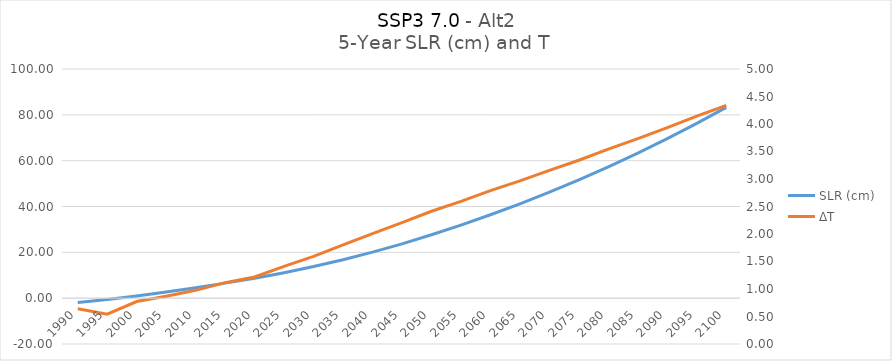
| Category | SLR (cm) |
|---|---|
| 1990.0 | -1.853 |
| 1995.0 | -0.626 |
| 2000.0 | 0.958 |
| 2005.0 | 2.678 |
| 2010.0 | 4.531 |
| 2015.0 | 6.565 |
| 2020.0 | 8.703 |
| 2025.0 | 11.118 |
| 2030.0 | 13.794 |
| 2035.0 | 16.788 |
| 2040.0 | 20.097 |
| 2045.0 | 23.714 |
| 2050.0 | 27.656 |
| 2055.0 | 31.867 |
| 2060.0 | 36.383 |
| 2065.0 | 41.164 |
| 2070.0 | 46.244 |
| 2075.0 | 51.606 |
| 2080.0 | 57.299 |
| 2085.0 | 63.288 |
| 2090.0 | 69.601 |
| 2095.0 | 76.259 |
| 2100.0 | 83.233 |